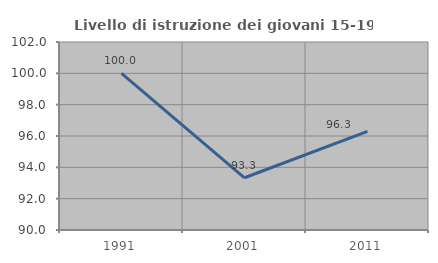
| Category | Livello di istruzione dei giovani 15-19 anni |
|---|---|
| 1991.0 | 100 |
| 2001.0 | 93.333 |
| 2011.0 | 96.296 |